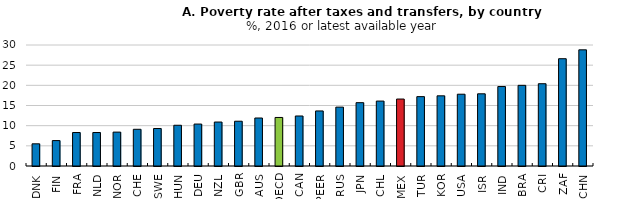
| Category | Series 0 |
|---|---|
| DNK | 5.5 |
| FIN | 6.3 |
| FRA | 8.3 |
| NLD | 8.3 |
| NOR | 8.4 |
| CHE | 9.1 |
| SWE | 9.3 |
| HUN | 10.1 |
| DEU | 10.4 |
| NZL | 10.9 |
| GBR | 11.1 |
| AUS | 11.9 |
| OECD | 12.035 |
| CAN | 12.4 |
| PEER | 13.65 |
| RUS | 14.6 |
| JPN | 15.7 |
| CHL | 16.1 |
| MEX | 16.6 |
| TUR | 17.2 |
| KOR | 17.4 |
| USA | 17.8 |
| ISR | 17.9 |
| IND | 19.7 |
| BRA | 20 |
| CRI | 20.4 |
| ZAF | 26.6 |
| CHN | 28.8 |